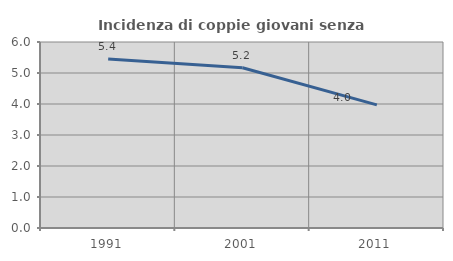
| Category | Incidenza di coppie giovani senza figli |
|---|---|
| 1991.0 | 5.448 |
| 2001.0 | 5.17 |
| 2011.0 | 3.971 |